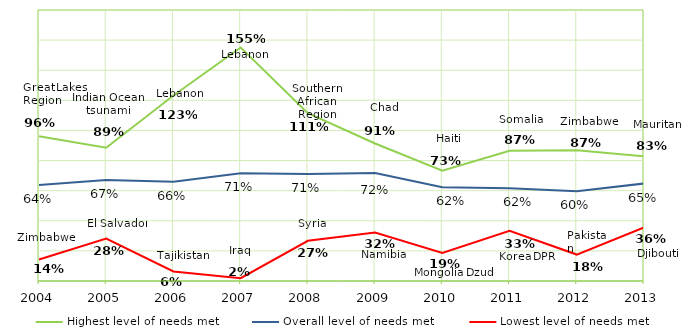
| Category | Highest level of needs met | Overall level of needs met  | Lowest level of needs met |
|---|---|---|---|
| 2004.0 | 0.961 | 0.637 | 0.142 |
| 2005.0 | 0.885 | 0.671 | 0.282 |
| 2006.0 | 1.232 | 0.66 | 0.064 |
| 2007.0 | 1.551 | 0.715 | 0.018 |
| 2008.0 | 1.115 | 0.711 | 0.267 |
| 2009.0 | 0.913 | 0.717 | 0.322 |
| 2010.0 | 0.733 | 0.622 | 0.186 |
| 2011.0 | 0.865 | 0.616 | 0.334 |
| 2012.0 | 0.868 | 0.596 | 0.176 |
| 2013.0 | 0.829 | 0.648 | 0.355 |